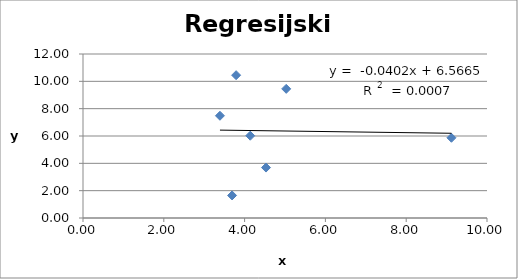
| Category | Series 0 |
|---|---|
| 3.39 | 7.48 |
| 3.69 | 1.65 |
| 3.79 | 10.45 |
| 4.14 | 6.02 |
| 4.53 | 3.69 |
| 5.03 | 9.45 |
| 9.12 | 5.87 |